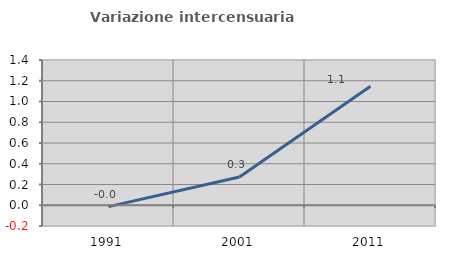
| Category | Variazione intercensuaria annua |
|---|---|
| 1991.0 | -0.014 |
| 2001.0 | 0.273 |
| 2011.0 | 1.146 |